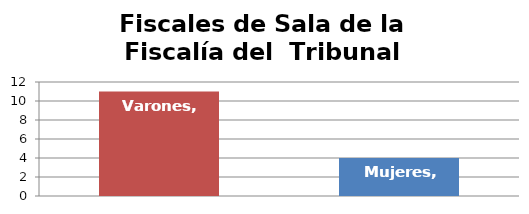
| Category | Fiscales de Sala de la Fiscalía del  Tribunal Supremo |
|---|---|
| Varones | 11 |
| Mujeres | 4 |